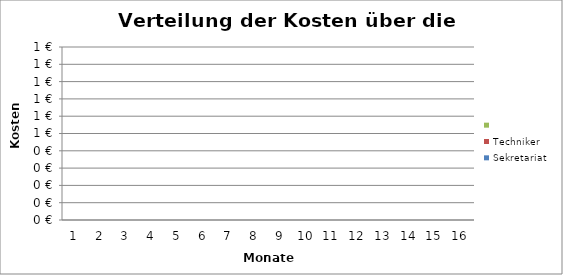
| Category | Sekretariat | Techniker | Series 1 |
|---|---|---|---|
| 1.0 | 0 | 0 | 0 |
| 2.0 | 0 | 0 | 0 |
| 3.0 | 0 | 0 | 0 |
| 4.0 | 0 | 0 | 0 |
| 5.0 | 0 | 0 | 0 |
| 6.0 | 0 | 0 | 0 |
| 7.0 | 0 | 0 | 0 |
| 8.0 | 0 | 0 | 0 |
| 9.0 | 0 | 0 | 0 |
| 10.0 | 0 | 0 | 0 |
| 11.0 | 0 | 0 | 0 |
| 12.0 | 0 | 0 | 0 |
| 13.0 | 0 | 0 | 0 |
| 14.0 | 0 | 0 | 0 |
| 15.0 | 0 | 0 | 0 |
| 16.0 | 0 | 0 | 0 |